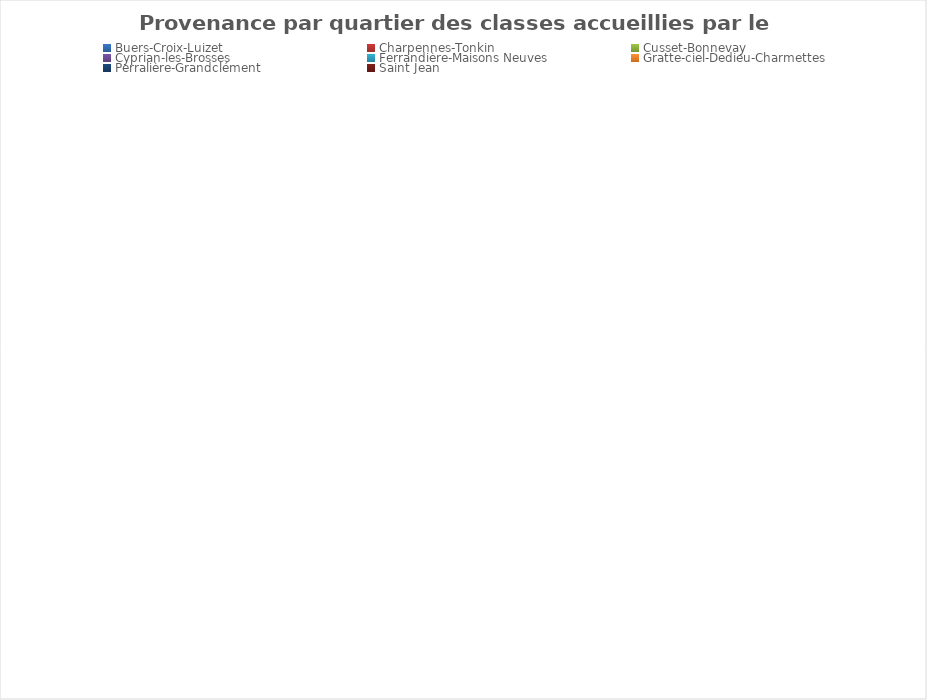
| Category | Series 0 |
|---|---|
| Buers-Croix-Luizet | 0 |
| Charpennes-Tonkin | 0 |
| Cusset-Bonnevay | 0 |
| Cyprian-les-Brosses | 0 |
| Ferrandière-Maisons Neuves | 0 |
| Gratte-ciel-Dedieu-Charmettes | 0 |
| Perralière-Grandclément | 0 |
| Saint Jean | 0 |